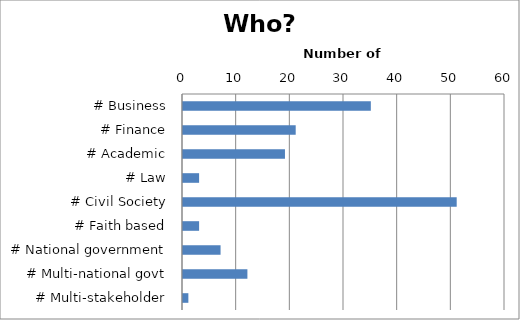
| Category | Series 0 |
|---|---|
| # Business | 35 |
| # Finance | 21 |
| # Academic | 19 |
| # Law | 3 |
| # Civil Society | 51 |
| # Faith based | 3 |
| # National government | 7 |
| # Multi-national govt | 12 |
| # Multi-stakeholder | 1 |